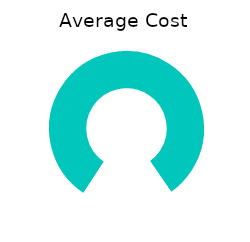
| Category | Average Cost |
|---|---|
| 0 | 130 |
| 1 | 0 |
| 2 | 30 |